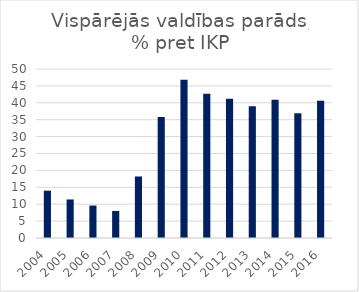
| Category | Latvia |
|---|---|
| 2004 | 14 |
| 2005 | 11.4 |
| 2006 | 9.6 |
| 2007 | 8 |
| 2008 | 18.2 |
| 2009 | 35.8 |
| 2010 | 46.8 |
| 2011 | 42.7 |
| 2012 | 41.2 |
| 2013 | 39 |
| 2014 | 40.9 |
| 2015 | 36.9 |
| 2016 | 40.6 |